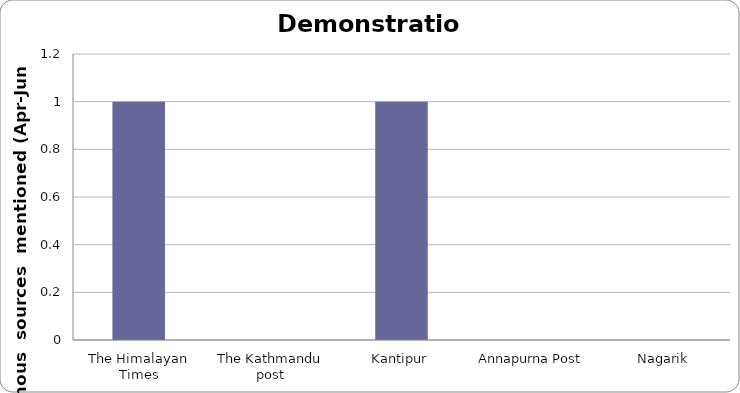
| Category | Demonstration |
|---|---|
| The Himalayan Times | 1 |
| The Kathmandu post | 0 |
| Kantipur | 1 |
| Annapurna Post | 0 |
| Nagarik | 0 |